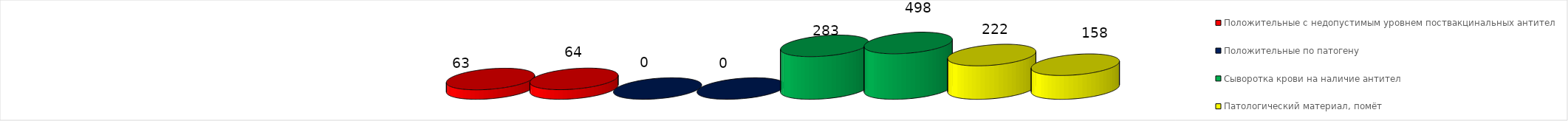
| Category | Положительные с недопустимым уровнем поствакцинальных антител | Положительные по патогену | Сыворотка крови на наличие антител | Патологический материал, помёт |
|---|---|---|---|---|
| Сыворотка крови на наличие антител | 64 | 0 | 302 | 158 |